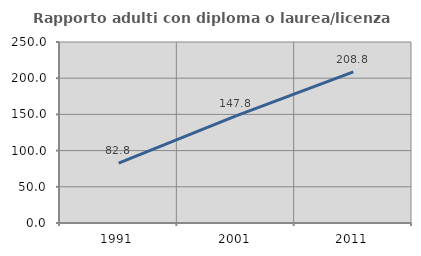
| Category | Rapporto adulti con diploma o laurea/licenza media  |
|---|---|
| 1991.0 | 82.78 |
| 2001.0 | 147.843 |
| 2011.0 | 208.775 |